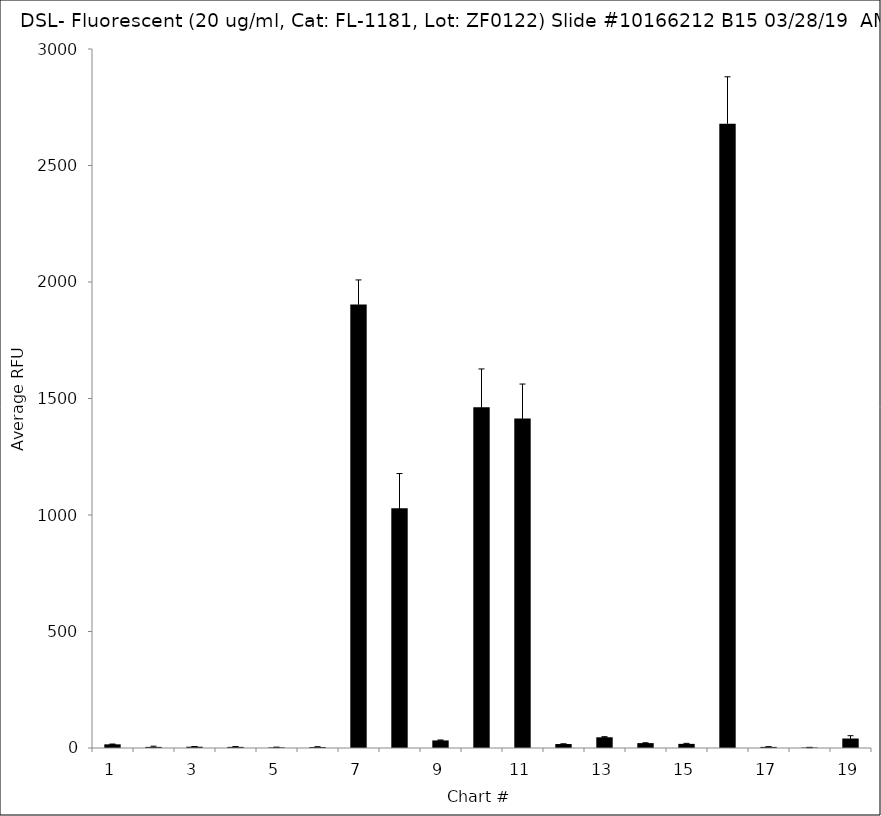
| Category | Series 0 |
|---|---|
| 1.0 | 15.75 |
| 2.0 | 4.75 |
| 3.0 | 5.5 |
| 4.0 | 4.75 |
| 5.0 | 2.75 |
| 6.0 | 4.25 |
| 7.0 | 1903 |
| 8.0 | 1029.5 |
| 9.0 | 32.5 |
| 10.0 | 1462 |
| 11.0 | 1414.25 |
| 12.0 | 17 |
| 13.0 | 46 |
| 14.0 | 21 |
| 15.0 | 17.75 |
| 16.0 | 2679.5 |
| 17.0 | 4.75 |
| 18.0 | 2 |
| 19.0 | 40.75 |